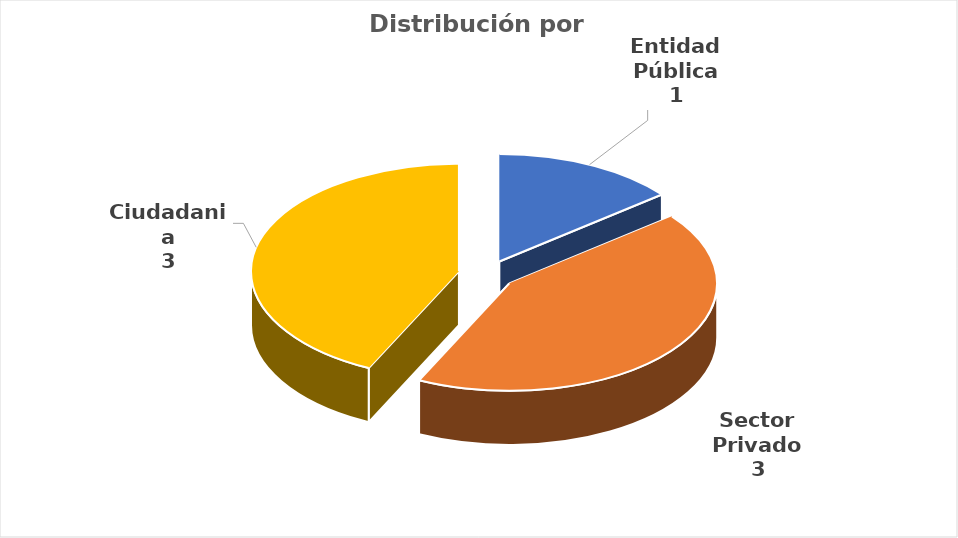
| Category | Series 0 |
|---|---|
| Entidad Pública | 1 |
| Sector Privado | 3 |
| Ciudadania | 3 |